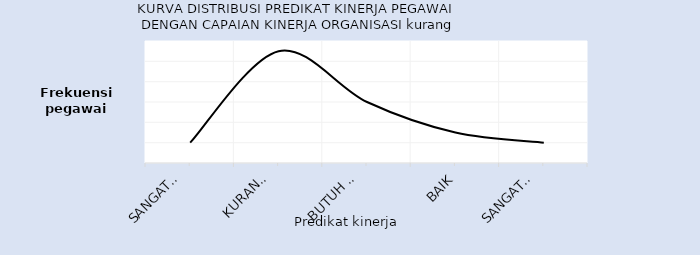
| Category | Series 0 |
|---|---|
| Sangat 
Kurang | 2 |
| Kurang/
Misconduct | 11 |
| Butuh 
Perbaikan | 6 |
| Baik | 3 |
| Sangat 
Baik | 2 |